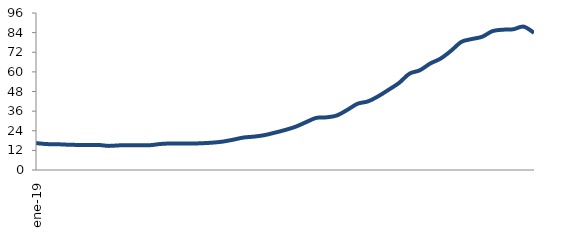
| Category | Series 0 |
|---|---|
| 2019-01-01 | 16.471 |
| 2019-02-01 | 15.859 |
| 2019-03-01 | 15.762 |
| 2019-04-01 | 15.486 |
| 2019-05-01 | 15.319 |
| 2019-06-01 | 15.27 |
| 2019-07-01 | 15.317 |
| 2019-08-01 | 14.744 |
| 2019-09-01 | 15.056 |
| 2019-10-01 | 15.116 |
| 2019-11-01 | 15.185 |
| 2019-12-01 | 15.165 |
| 2020-01-01 | 15.917 |
| 2020-02-01 | 16.225 |
| 2020-03-01 | 16.228 |
| 2020-04-01 | 16.172 |
| 2020-05-01 | 16.362 |
| 2020-06-01 | 16.723 |
| 2020-07-01 | 17.365 |
| 2020-08-01 | 18.526 |
| 2020-09-01 | 19.846 |
| 2020-10-01 | 20.404 |
| 2020-11-01 | 21.294 |
| 2020-12-01 | 22.781 |
| 2021-01-01 | 24.447 |
| 2021-02-01 | 26.406 |
| 2021-03-01 | 29.172 |
| 2021-04-01 | 31.839 |
| 2021-05-01 | 32.208 |
| 2021-06-01 | 33.334 |
| 2021-07-01 | 36.745 |
| 2021-08-01 | 40.523 |
| 2021-09-01 | 41.963 |
| 2021-10-01 | 45.141 |
| 2021-11-01 | 49.115 |
| 2021-12-01 | 53.284 |
| 2022-01-01 | 58.918 |
| 2022-02-01 | 60.986 |
| 2022-03-01 | 65.12 |
| 2022-04-01 | 68.133 |
| 2022-05-01 | 72.877 |
| 2022-06-01 | 78.33 |
| 2022-07-01 | 80.069 |
| 2022-08-01 | 81.469 |
| 2022-09-01 | 84.915 |
| 2022-10-01 | 85.787 |
| 2022-11-01 | 86.039 |
| 2022-12-01 | 87.664 |
| 2023-01-01 | 83.881 |